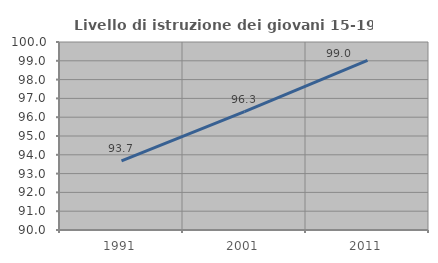
| Category | Livello di istruzione dei giovani 15-19 anni |
|---|---|
| 1991.0 | 93.675 |
| 2001.0 | 96.296 |
| 2011.0 | 99.02 |